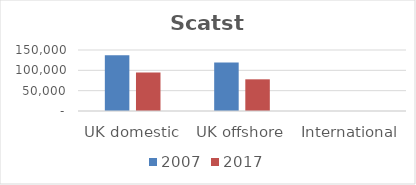
| Category | 2007 | 2017 |
|---|---|---|
| UK domestic | 137020 | 94640 |
| UK offshore | 119002 | 77901 |
| International | 0 | 0 |